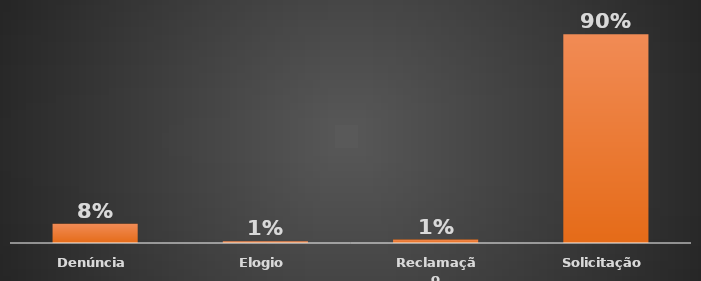
| Category | Total |
|---|---|
| Denúncia | 0.082 |
| Elogio | 0.007 |
| Reclamação | 0.015 |
| Solicitação | 0.896 |